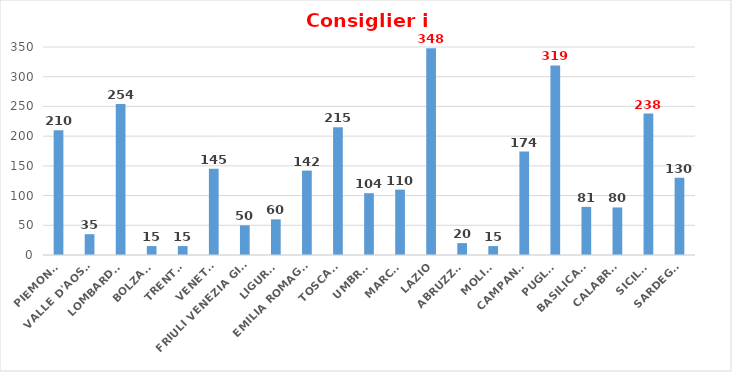
| Category | Series 0 |
|---|---|
| PIEMONTE | 210 |
| VALLE D'AOSTA | 35 |
| LOMBARDIA | 254 |
| BOLZANO | 15 |
| TRENTO | 15 |
| VENETO | 145 |
| FRIULI VENEZIA GIULIA | 50 |
| LIGURIA | 60 |
| EMILIA ROMAGNA | 142 |
| TOSCANA | 215 |
| UMBRIA | 104 |
| MARCHE | 110 |
| LAZIO | 348 |
| ABRUZZO | 20 |
| MOLISE | 15 |
| CAMPANIA | 174 |
| PUGLIA | 319 |
| BASILICATA | 81 |
| CALABRIA | 80 |
| SICILIA | 238 |
| SARDEGNA | 130 |